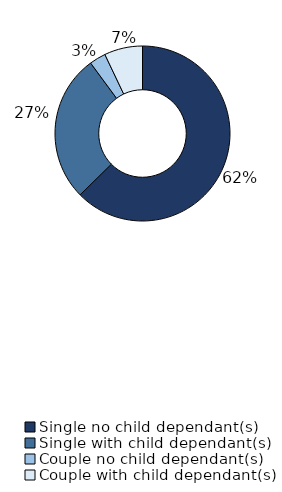
| Category | Series 0 |
|---|---|
| Single no child dependant(s) | 0.62 |
| Single with child dependant(s) | 0.27 |
| Couple no child dependant(s) | 0.03 |
| Couple with child dependant(s) | 0.07 |